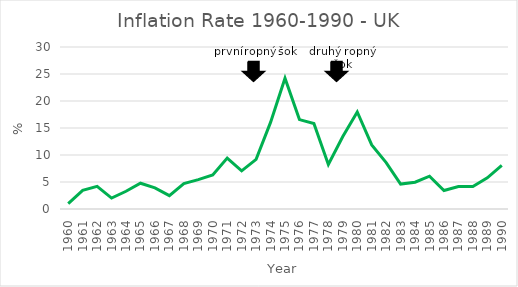
| Category | UK |
|---|---|
| 1960.0 | 1 |
| 1961.0 | 3.45 |
| 1962.0 | 4.2 |
| 1963.0 | 2.02 |
| 1964.0 | 3.28 |
| 1965.0 | 4.77 |
| 1966.0 | 3.91 |
| 1967.0 | 2.48 |
| 1968.0 | 4.7 |
| 1969.0 | 5.45 |
| 1970.0 | 6.3 |
| 1971.0 | 9.44 |
| 1972.0 | 7.07 |
| 1973.0 | 9.2 |
| 1974.0 | 16.04 |
| 1975.0 | 24.21 |
| 1976.0 | 16.56 |
| 1977.0 | 15.84 |
| 1978.0 | 8.26 |
| 1979.0 | 13.42 |
| 1980.0 | 17.97 |
| 1981.0 | 11.88 |
| 1982.0 | 8.6 |
| 1983.0 | 4.61 |
| 1984.0 | 4.96 |
| 1985.0 | 6.07 |
| 1986.0 | 3.43 |
| 1987.0 | 4.15 |
| 1988.0 | 4.16 |
| 1989.0 | 5.76 |
| 1990.0 | 8.06 |